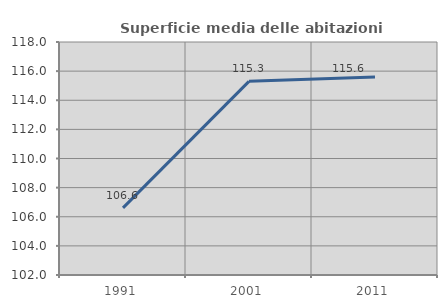
| Category | Superficie media delle abitazioni occupate |
|---|---|
| 1991.0 | 106.611 |
| 2001.0 | 115.296 |
| 2011.0 | 115.602 |